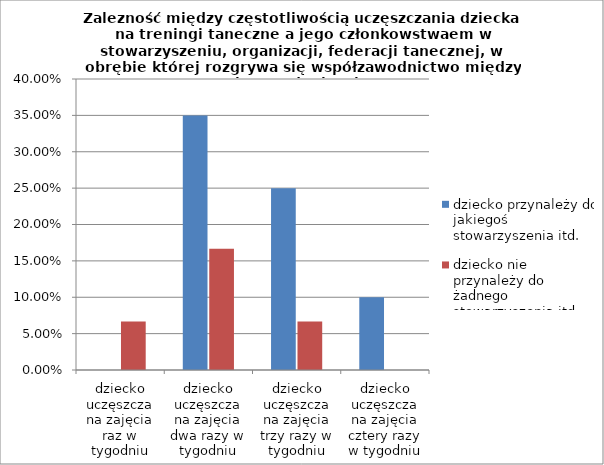
| Category | dziecko przynależy do jakiegoś stowarzyszenia itd. | dziecko nie przynależy do żadnego stowarzyszenia itd. |
|---|---|---|
| dziecko uczęszcza na zajęcia raz w tygodniu | 0 | 0.067 |
| dziecko uczęszcza na zajęcia dwa razy w tygodniu | 0.35 | 0.167 |
| dziecko uczęszcza na zajęcia trzy razy w tygodniu | 0.25 | 0.067 |
| dziecko uczęszcza na zajęcia cztery razy w tygodniu | 0.1 | 0 |